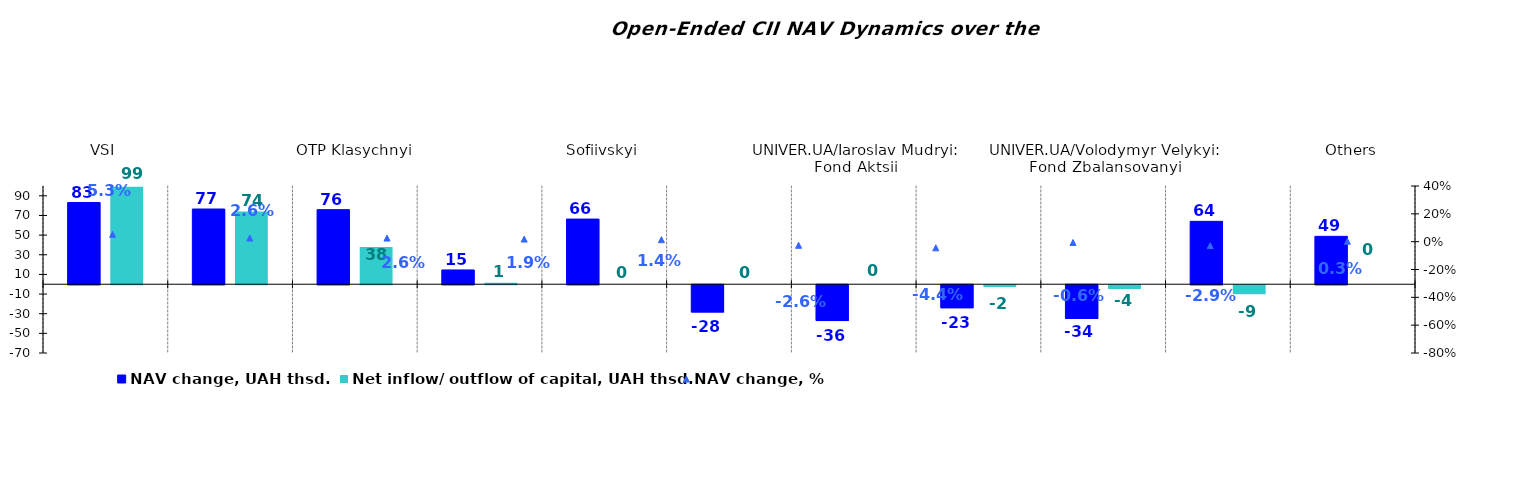
| Category | NAV change, UAH thsd. | Net inflow/ outflow of capital, UAH thsd. |
|---|---|---|
| VSI | 83.202 | 99.193 |
| ОТP Fond Aktsii | 76.587 | 74.119 |
| ОТP Klasychnyi | 75.907 | 37.843 |
| Nadbannia | 14.547 | 1.405 |
| Sofiivskyi | 66.337 | 0 |
| ТАSK Resurs | -27.734 | 0 |
| UNIVER.UA/Iaroslav Mudryi: Fond Aktsii | -36.48 | 0 |
| KINTO-Ekviti | -23.4 | -1.757 |
| UNIVER.UA/Volodymyr Velykyi: Fond Zbalansovanyi | -34.295 | -3.927 |
| KINTO-Klasychnyi | 64.022 | -9.303 |
| Others | 48.756 | 0 |